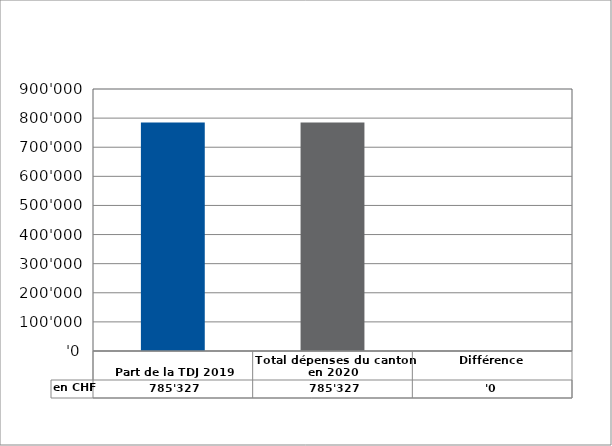
| Category | en CHF |
|---|---|
| 
Part de la TDJ 2019

 | 785327 |
| Total dépenses du canton en 2020 | 785327 |
| Différence | 0 |